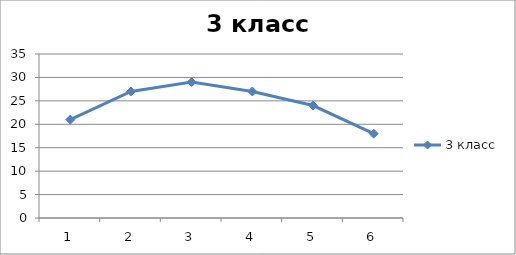
| Category | 3 класс |
|---|---|
| 0 | 21 |
| 1 | 27 |
| 2 | 29 |
| 3 | 27 |
| 4 | 24 |
| 5 | 18 |